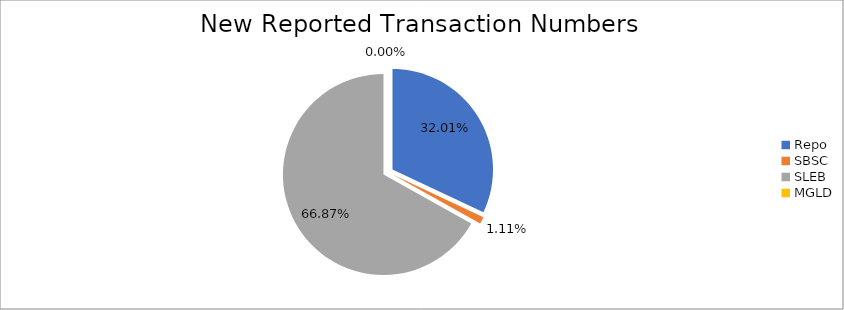
| Category | Series 0 |
|---|---|
| Repo | 312438 |
| SBSC | 10877 |
| SLEB | 652680 |
| MGLD | 18 |